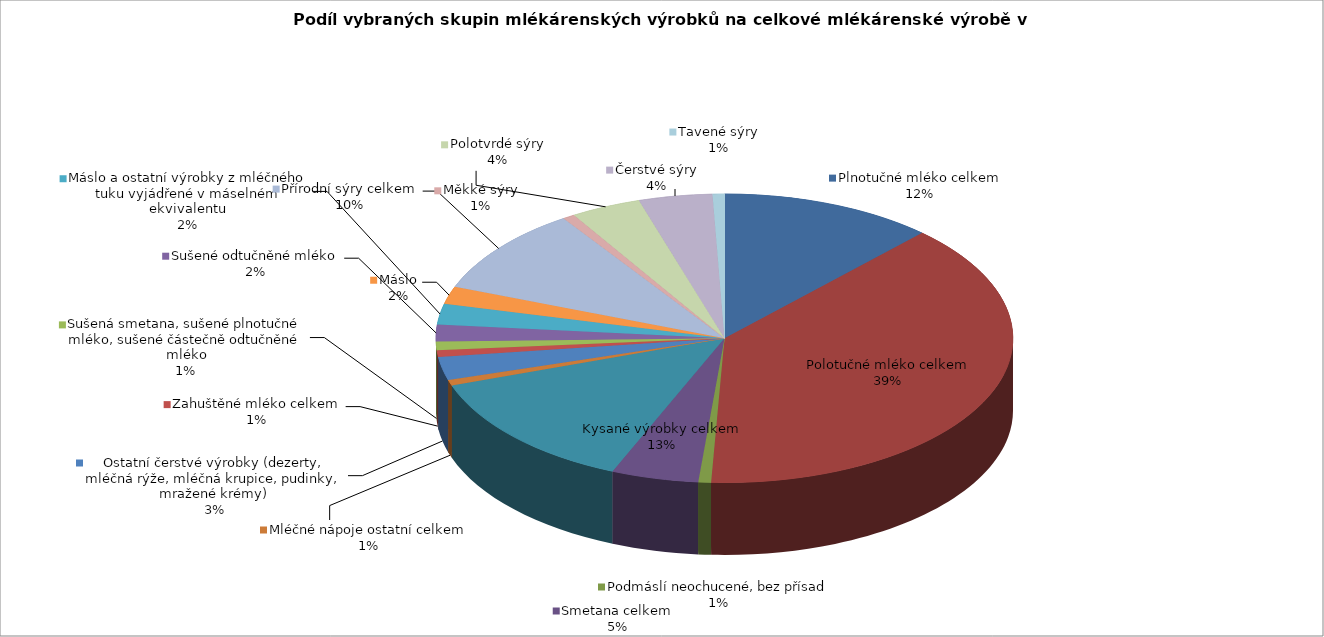
| Category | 2015                       množství (1000 t) |
|---|---|
| Plnotučné mléko celkem | 150.765 |
| Polotučné mléko celkem | 487.11 |
| Podmáslí neochucené, bez přísad | 8.965 |
| Smetana celkem | 61.426 |
| Kysané výrobky celkem | 167.754 |
| Mléčné nápoje ostatní celkem | 8.26 |
| Ostatní čerstvé výrobky (dezerty, mléčná rýže, mléčná krupice, pudinky, mražené krémy) | 32.576 |
| Zahuštěné mléko celkem | 9.299 |
| Sušená smetana, sušené plnotučné mléko, sušené částečně odtučněné mléko | 12.205 |
| Sušené odtučněné mléko | 23.564 |
| Máslo a ostatní výrobky z mléčného tuku vyjádřené v máselném ekvivalentu | 29.434 |
| Máslo | 24.416 |
| Přírodní sýry celkem | 123.008 |
| Měkké sýry | 8.651 |
| Polotvrdé sýry | 49.513 |
| Čerstvé sýry | 51.87 |
| Tavené sýry | 8.376 |